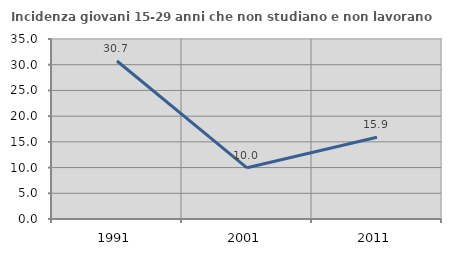
| Category | Incidenza giovani 15-29 anni che non studiano e non lavorano  |
|---|---|
| 1991.0 | 30.719 |
| 2001.0 | 9.954 |
| 2011.0 | 15.899 |